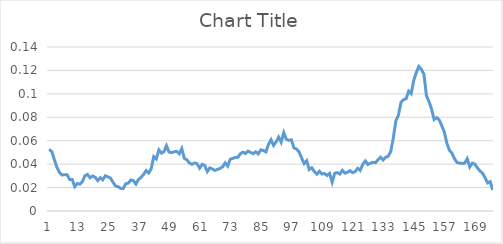
| Category | Series 0 |
|---|---|
| 0 | 0.053 |
| 1 | 0.051 |
| 2 | 0.044 |
| 3 | 0.037 |
| 4 | 0.033 |
| 5 | 0.031 |
| 6 | 0.031 |
| 7 | 0.031 |
| 8 | 0.027 |
| 9 | 0.027 |
| 10 | 0.021 |
| 11 | 0.024 |
| 12 | 0.023 |
| 13 | 0.025 |
| 14 | 0.03 |
| 15 | 0.031 |
| 16 | 0.028 |
| 17 | 0.03 |
| 18 | 0.029 |
| 19 | 0.026 |
| 20 | 0.028 |
| 21 | 0.027 |
| 22 | 0.03 |
| 23 | 0.029 |
| 24 | 0.028 |
| 25 | 0.025 |
| 26 | 0.021 |
| 27 | 0.021 |
| 28 | 0.019 |
| 29 | 0.019 |
| 30 | 0.023 |
| 31 | 0.024 |
| 32 | 0.027 |
| 33 | 0.026 |
| 34 | 0.023 |
| 35 | 0.027 |
| 36 | 0.029 |
| 37 | 0.031 |
| 38 | 0.035 |
| 39 | 0.032 |
| 40 | 0.036 |
| 41 | 0.046 |
| 42 | 0.044 |
| 43 | 0.052 |
| 44 | 0.049 |
| 45 | 0.051 |
| 46 | 0.056 |
| 47 | 0.05 |
| 48 | 0.05 |
| 49 | 0.051 |
| 50 | 0.051 |
| 51 | 0.049 |
| 52 | 0.053 |
| 53 | 0.045 |
| 54 | 0.044 |
| 55 | 0.041 |
| 56 | 0.04 |
| 57 | 0.041 |
| 58 | 0.04 |
| 59 | 0.037 |
| 60 | 0.04 |
| 61 | 0.039 |
| 62 | 0.034 |
| 63 | 0.037 |
| 64 | 0.036 |
| 65 | 0.035 |
| 66 | 0.036 |
| 67 | 0.036 |
| 68 | 0.038 |
| 69 | 0.041 |
| 70 | 0.038 |
| 71 | 0.044 |
| 72 | 0.045 |
| 73 | 0.046 |
| 74 | 0.046 |
| 75 | 0.049 |
| 76 | 0.05 |
| 77 | 0.049 |
| 78 | 0.051 |
| 79 | 0.05 |
| 80 | 0.049 |
| 81 | 0.051 |
| 82 | 0.049 |
| 83 | 0.052 |
| 84 | 0.052 |
| 85 | 0.051 |
| 86 | 0.057 |
| 87 | 0.061 |
| 88 | 0.056 |
| 89 | 0.059 |
| 90 | 0.063 |
| 91 | 0.059 |
| 92 | 0.067 |
| 93 | 0.061 |
| 94 | 0.06 |
| 95 | 0.061 |
| 96 | 0.054 |
| 97 | 0.053 |
| 98 | 0.051 |
| 99 | 0.045 |
| 100 | 0.041 |
| 101 | 0.043 |
| 102 | 0.035 |
| 103 | 0.037 |
| 104 | 0.034 |
| 105 | 0.031 |
| 106 | 0.034 |
| 107 | 0.032 |
| 108 | 0.032 |
| 109 | 0.03 |
| 110 | 0.032 |
| 111 | 0.025 |
| 112 | 0.032 |
| 113 | 0.033 |
| 114 | 0.032 |
| 115 | 0.035 |
| 116 | 0.032 |
| 117 | 0.033 |
| 118 | 0.034 |
| 119 | 0.033 |
| 120 | 0.034 |
| 121 | 0.036 |
| 122 | 0.035 |
| 123 | 0.04 |
| 124 | 0.043 |
| 125 | 0.04 |
| 126 | 0.041 |
| 127 | 0.042 |
| 128 | 0.041 |
| 129 | 0.044 |
| 130 | 0.046 |
| 131 | 0.044 |
| 132 | 0.046 |
| 133 | 0.047 |
| 134 | 0.051 |
| 135 | 0.063 |
| 136 | 0.077 |
| 137 | 0.082 |
| 138 | 0.093 |
| 139 | 0.095 |
| 140 | 0.096 |
| 141 | 0.102 |
| 142 | 0.1 |
| 143 | 0.111 |
| 144 | 0.118 |
| 145 | 0.123 |
| 146 | 0.121 |
| 147 | 0.117 |
| 148 | 0.098 |
| 149 | 0.093 |
| 150 | 0.087 |
| 151 | 0.078 |
| 152 | 0.08 |
| 153 | 0.078 |
| 154 | 0.073 |
| 155 | 0.067 |
| 156 | 0.058 |
| 157 | 0.052 |
| 158 | 0.049 |
| 159 | 0.045 |
| 160 | 0.041 |
| 161 | 0.041 |
| 162 | 0.041 |
| 163 | 0.041 |
| 164 | 0.045 |
| 165 | 0.038 |
| 166 | 0.041 |
| 167 | 0.04 |
| 168 | 0.037 |
| 169 | 0.034 |
| 170 | 0.032 |
| 171 | 0.028 |
| 172 | 0.024 |
| 173 | 0.025 |
| 174 | 0.018 |